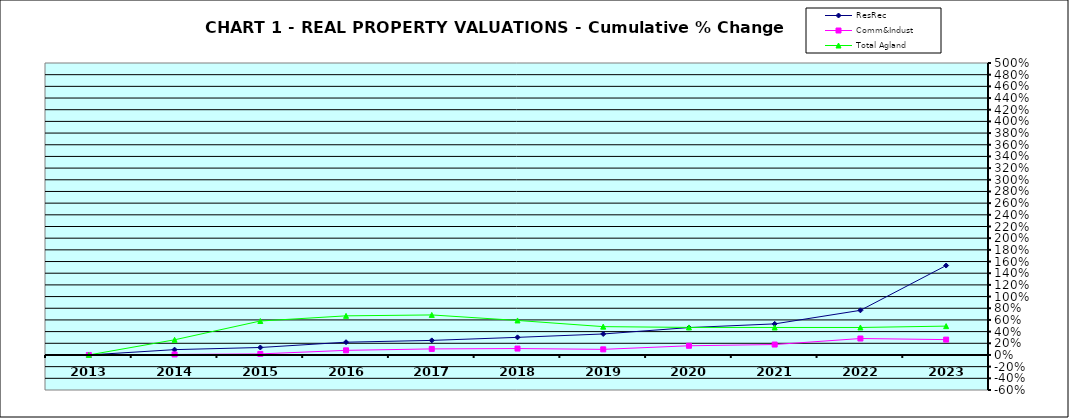
| Category | ResRec | Comm&Indust | Total Agland |
|---|---|---|---|
| 2013.0 | 0 | 0 | 0 |
| 2014.0 | 0.091 | 0.009 | 0.26 |
| 2015.0 | 0.128 | 0.018 | 0.581 |
| 2016.0 | 0.219 | 0.079 | 0.67 |
| 2017.0 | 0.249 | 0.104 | 0.685 |
| 2018.0 | 0.302 | 0.11 | 0.591 |
| 2019.0 | 0.36 | 0.096 | 0.485 |
| 2020.0 | 0.469 | 0.158 | 0.472 |
| 2021.0 | 0.532 | 0.179 | 0.471 |
| 2022.0 | 0.764 | 0.282 | 0.471 |
| 2023.0 | 1.532 | 0.263 | 0.494 |